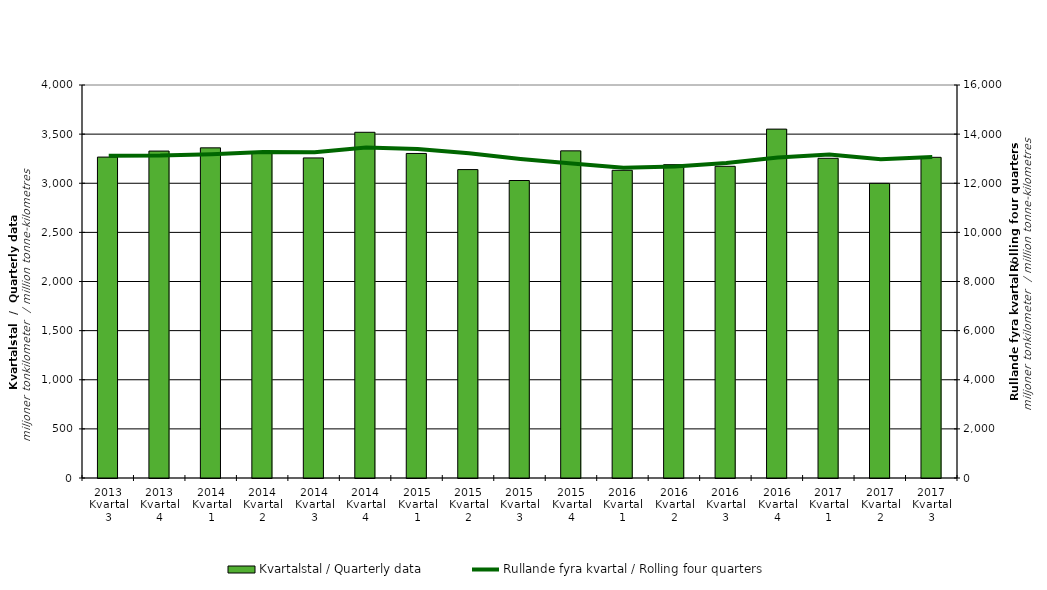
| Category | Kvartalstal / Quarterly data |
|---|---|
| 2013 Kvartal 3 | 3266.245 |
| 2013 Kvartal 4 | 3327.51 |
| 2014 Kvartal 1 | 3360.327 |
| 2014 Kvartal 2 | 3318.946 |
| 2014 Kvartal 3 | 3257.731 |
| 2014 Kvartal 4 | 3518.717 |
| 2015 Kvartal 1 | 3303.252 |
| 2015 Kvartal 2 | 3139.108 |
| 2015 Kvartal 3 | 3027.85 |
| 2015 Kvartal 4 | 3329.686 |
| 2016 Kvartal 1 | 3131.908 |
| 2016 Kvartal 2 | 3189.179 |
| 2016 Kvartal 3 | 3172.4 |
| 2016 Kvartal 4 | 3550.917 |
| 2017 Kvartal 1 | 3253.908 |
| 2017 Kvartal 2 | 2998.966 |
| 2017 Kvartal 3 | 3263.893 |